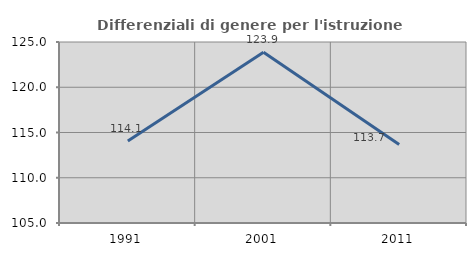
| Category | Differenziali di genere per l'istruzione superiore |
|---|---|
| 1991.0 | 114.053 |
| 2001.0 | 123.873 |
| 2011.0 | 113.671 |